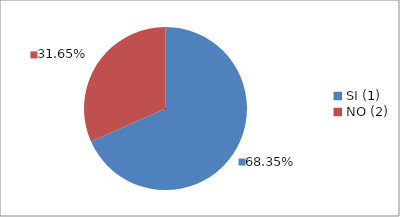
| Category | Series 0 |
|---|---|
| SI (1) | 0.684 |
| NO (2) | 0.316 |